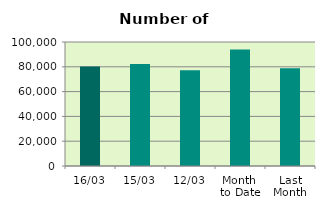
| Category | Series 0 |
|---|---|
| 16/03 | 80162 |
| 15/03 | 82198 |
| 12/03 | 77118 |
| Month 
to Date | 93859.833 |
| Last
Month | 78748.7 |